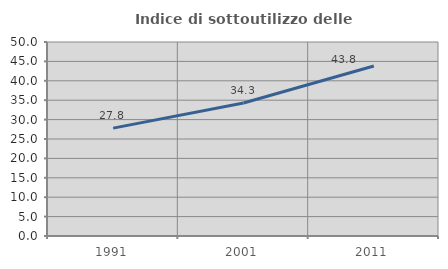
| Category | Indice di sottoutilizzo delle abitazioni  |
|---|---|
| 1991.0 | 27.81 |
| 2001.0 | 34.263 |
| 2011.0 | 43.802 |